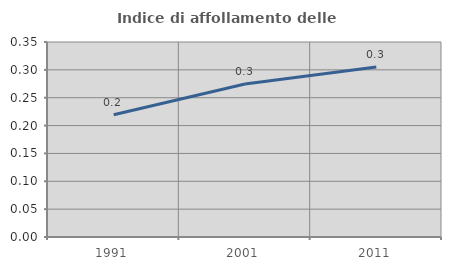
| Category | Indice di affollamento delle abitazioni  |
|---|---|
| 1991.0 | 0.219 |
| 2001.0 | 0.275 |
| 2011.0 | 0.305 |